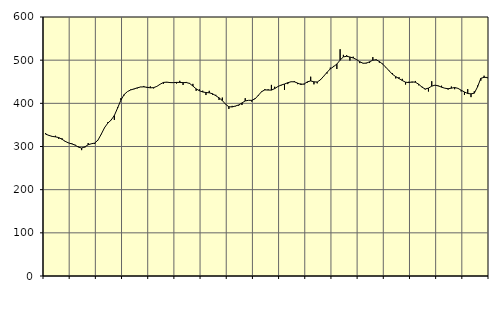
| Category | Piggar | Series 1 |
|---|---|---|
| nan | 331 | 328.6 |
| 87.0 | 326.2 | 325.7 |
| 87.0 | 322.6 | 323.39 |
| 87.0 | 324.9 | 322.35 |
| nan | 317.7 | 320.74 |
| 88.0 | 319.2 | 316.77 |
| 88.0 | 310.7 | 311.92 |
| 88.0 | 308.6 | 308.17 |
| nan | 307.4 | 306.06 |
| 89.0 | 304 | 303.21 |
| 89.0 | 300 | 298.6 |
| 89.0 | 291.6 | 296.44 |
| nan | 297.7 | 299.28 |
| 90.0 | 308 | 304.08 |
| 90.0 | 306 | 306.39 |
| 90.0 | 305.8 | 307.92 |
| nan | 314.6 | 314.93 |
| 91.0 | 328.1 | 328.57 |
| 91.0 | 342.7 | 343.6 |
| 91.0 | 356.2 | 354.16 |
| nan | 361.6 | 361.03 |
| 92.0 | 361.5 | 371.9 |
| 92.0 | 391.4 | 389.26 |
| 92.0 | 412.1 | 407.54 |
| nan | 418.5 | 420.41 |
| 93.0 | 427.2 | 427.2 |
| 93.0 | 432.1 | 431.04 |
| 93.0 | 432.7 | 433.38 |
| nan | 434.6 | 435.86 |
| 94.0 | 438.1 | 437.83 |
| 94.0 | 440.2 | 438.21 |
| 94.0 | 435.8 | 437.15 |
| nan | 439.2 | 435.94 |
| 95.0 | 434.6 | 436.36 |
| 95.0 | 439.3 | 439.27 |
| 95.0 | 444.1 | 444.29 |
| nan | 445.3 | 448.36 |
| 96.0 | 448.3 | 449.15 |
| 96.0 | 448 | 448.05 |
| 96.0 | 447.3 | 447.9 |
| nan | 445.9 | 448.51 |
| 97.0 | 452.1 | 448.42 |
| 97.0 | 442.5 | 447.99 |
| 97.0 | 449.5 | 448.16 |
| nan | 447.2 | 446.06 |
| 98.0 | 445.1 | 440.11 |
| 98.0 | 429 | 433.56 |
| 98.0 | 432.3 | 429.08 |
| nan | 429.2 | 426.31 |
| 99.0 | 419.2 | 425.04 |
| 99.0 | 429 | 424.43 |
| 99.0 | 419.9 | 422.22 |
| nan | 419.8 | 417.63 |
| 0.0 | 407.8 | 412.73 |
| 0.0 | 413.3 | 406.43 |
| 0.0 | 398.3 | 397.82 |
| nan | 386.9 | 392.07 |
| 1.0 | 394.1 | 391.65 |
| 1.0 | 393.1 | 393.78 |
| 1.0 | 394.6 | 396.25 |
| nan | 396.1 | 400.91 |
| 2.0 | 411.9 | 405.62 |
| 2.0 | 406.9 | 406.93 |
| 2.0 | 403.9 | 406.94 |
| nan | 411.8 | 410.42 |
| 3.0 | 417.2 | 418.51 |
| 3.0 | 427.9 | 426.99 |
| 3.0 | 433 | 431.18 |
| nan | 432.4 | 430.77 |
| 4.0 | 442.7 | 430.65 |
| 4.0 | 438.4 | 434.08 |
| 4.0 | 439.1 | 439.03 |
| nan | 441.5 | 442.4 |
| 5.0 | 431.2 | 444.75 |
| 5.0 | 444.6 | 447.76 |
| 5.0 | 450.2 | 450 |
| nan | 451.7 | 449.86 |
| 6.0 | 444.4 | 446.93 |
| 6.0 | 446 | 443.75 |
| 6.0 | 443.6 | 444.93 |
| nan | 448 | 449.81 |
| 7.0 | 461.7 | 451.9 |
| 7.0 | 444 | 449.84 |
| 7.0 | 446.3 | 449.39 |
| nan | 455.7 | 454.5 |
| 8.0 | 462.7 | 463.05 |
| 8.0 | 469.1 | 471.77 |
| 8.0 | 482.7 | 479.76 |
| nan | 486.6 | 485.14 |
| 9.0 | 479.6 | 490.96 |
| 9.0 | 525.3 | 500.13 |
| 9.0 | 512.3 | 507.57 |
| nan | 511.6 | 509.02 |
| 10.0 | 499.1 | 507.28 |
| 10.0 | 508 | 505.12 |
| 10.0 | 502.1 | 501.54 |
| nan | 493.2 | 496.38 |
| 11.0 | 493.3 | 492.86 |
| 11.0 | 494 | 493.03 |
| 11.0 | 493.4 | 496.2 |
| nan | 507.1 | 499.98 |
| 12.0 | 502 | 500.66 |
| 12.0 | 494.2 | 497.12 |
| 12.0 | 491.9 | 490.75 |
| nan | 482.9 | 483.44 |
| 13.0 | 475.6 | 475.1 |
| 13.0 | 469.8 | 467.25 |
| 13.0 | 457.7 | 461.85 |
| nan | 460.6 | 457.4 |
| 14.0 | 456.7 | 452.84 |
| 14.0 | 443.6 | 448.96 |
| 14.0 | 450.1 | 448.09 |
| nan | 448.1 | 449.65 |
| 15.0 | 451.8 | 448.85 |
| 15.0 | 441.8 | 444.34 |
| 15.0 | 438.6 | 437.63 |
| nan | 432.1 | 433.14 |
| 16.0 | 427.4 | 435.25 |
| 16.0 | 451.2 | 439.82 |
| 16.0 | 441.9 | 442.08 |
| nan | 439.7 | 440.56 |
| 17.0 | 440.8 | 437.45 |
| 17.0 | 435 | 435.02 |
| 17.0 | 431.9 | 433.89 |
| nan | 438.9 | 435.07 |
| 18.0 | 432.7 | 436.66 |
| 18.0 | 434.5 | 434.71 |
| 18.0 | 427.6 | 430.44 |
| nan | 419.5 | 426.26 |
| 19.0 | 433 | 422.75 |
| 19.0 | 414.4 | 421.97 |
| 19.0 | 427.9 | 423.45 |
| nan | 441.2 | 438.16 |
| 20.0 | 452.6 | 457.95 |
| 20.0 | 464 | 460.16 |
| 20.0 | 458.2 | 460 |